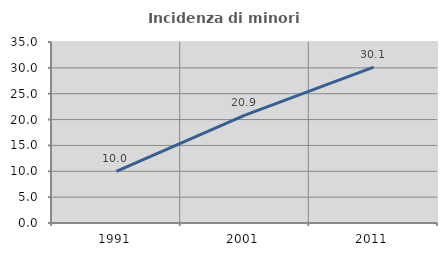
| Category | Incidenza di minori stranieri |
|---|---|
| 1991.0 | 10 |
| 2001.0 | 20.851 |
| 2011.0 | 30.144 |